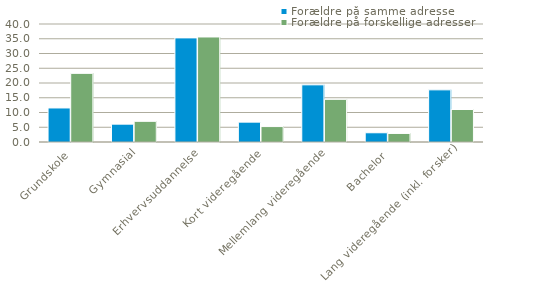
| Category | Forældre på samme adresse | Forældre på forskellige adresser |
|---|---|---|
| Grundskole | 11.537 | 23.263 |
| Gymnasial | 6.048 | 7.012 |
| Erhvervsuddannelse | 35.291 | 35.602 |
| Kort videregående | 6.727 | 5.23 |
| Mellemlang videregående | 19.38 | 14.456 |
| Bachelor | 3.126 | 2.901 |
| Lang videregående (inkl. forsker) | 17.677 | 11.014 |